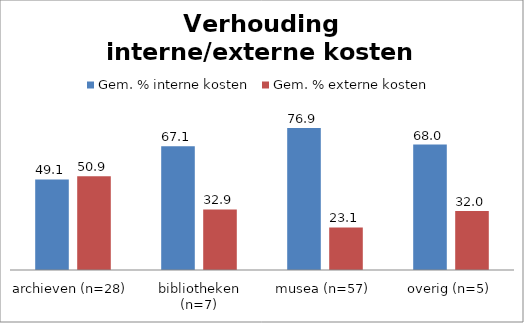
| Category | Gem. % interne kosten | Gem. % externe kosten |
|---|---|---|
| archieven (n=28) | 49.107 | 50.893 |
| bibliotheken (n=7) | 67.143 | 32.857 |
| musea (n=57) | 76.946 | 23.054 |
| overig (n=5) | 68 | 32 |